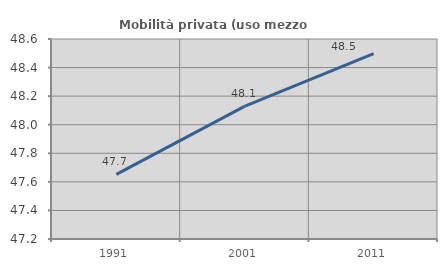
| Category | Mobilità privata (uso mezzo privato) |
|---|---|
| 1991.0 | 47.653 |
| 2001.0 | 48.13 |
| 2011.0 | 48.497 |